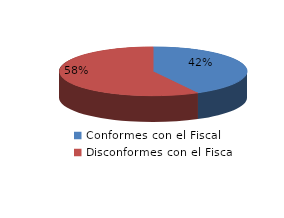
| Category | Series 0 |
|---|---|
| 0 | 16 |
| 1 | 22 |